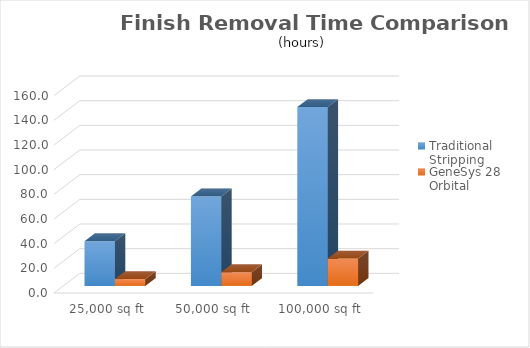
| Category | Traditional Stripping | GeneSys 28 Orbital |
|---|---|---|
| 25,000 sq ft | 36.262 | 5.556 |
| 50,000 sq ft | 72.525 | 11.111 |
| 100,000 sq ft | 145.05 | 22.222 |